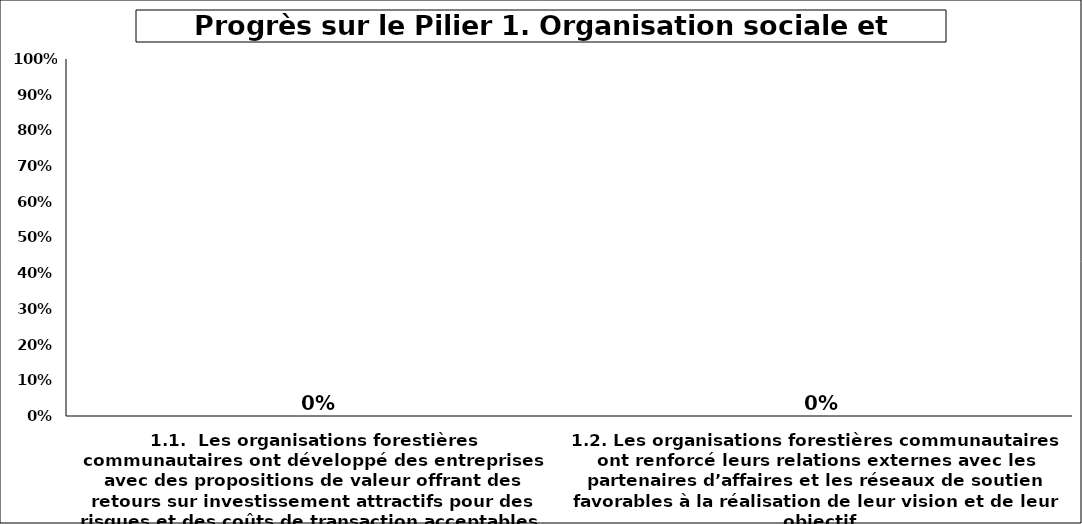
| Category | Series 6 |
|---|---|
| 1.1.  Les organisations forestières communautaires ont développé des entreprises avec des propositions de valeur offrant des retours sur investissement attractifs pour des risques et des coûts de transaction acceptables  | 0 |
| 1.2. Les organisations forestières communautaires ont renforcé leurs relations externes avec les partenaires d’affaires et les réseaux de soutien favorables à la réalisation de leur vision et de leur objectif | 0 |